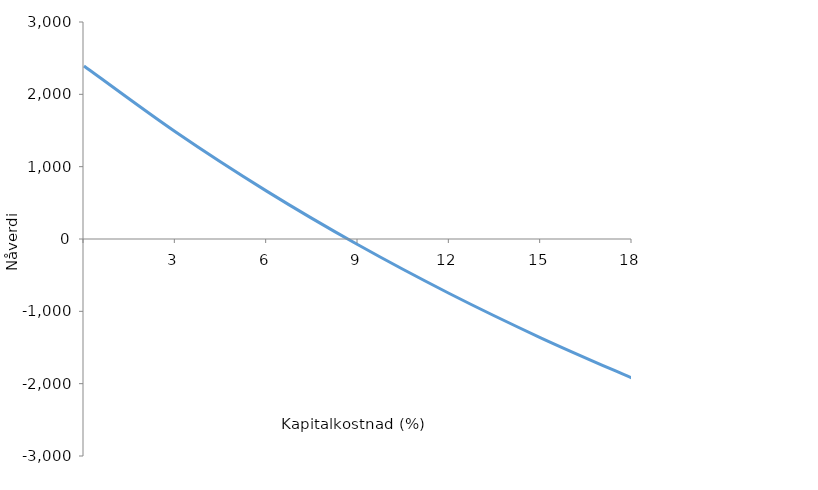
| Category | Alfa | 0 |
|---|---|---|
| nan | 2392 |  |
| 3.0 | 1481.97 |  |
| 6.0 | 661.561 |  |
| 9.0 | -80.379 |  |
| 12.0 | -753.347 |  |
| 15.0 | -1365.466 |  |
| 18.0 | -1923.713 |  |